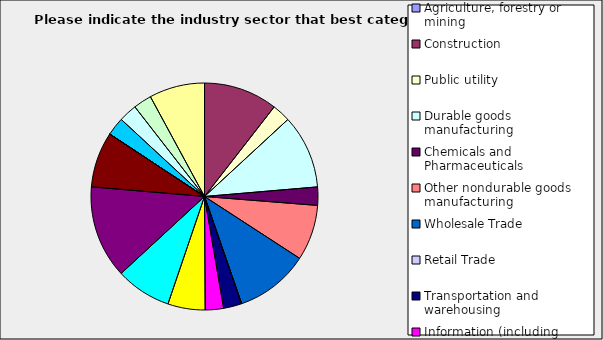
| Category | Series 0 |
|---|---|
| Agriculture, forestry or mining | 0 |
| Construction | 0.105 |
| Public utility | 0.026 |
| Durable goods manufacturing | 0.105 |
| Chemicals and Pharmaceuticals | 0.026 |
| Other nondurable goods manufacturing | 0.079 |
| Wholesale Trade | 0.105 |
| Retail Trade | 0 |
| Transportation and warehousing | 0.026 |
| Information (including broadcasting and telecommunication) | 0.026 |
| Finance and Insurance | 0.053 |
| Real Estate | 0.079 |
| Professional, scientific and technical services | 0.132 |
| Consulting | 0.079 |
| Administrative and office services (including waste management) | 0 |
| Education | 0 |
| Health Care and social services | 0.026 |
| Arts, entertainment and recreation | 0.026 |
| Accommodation and food services | 0.026 |
| Other | 0.079 |